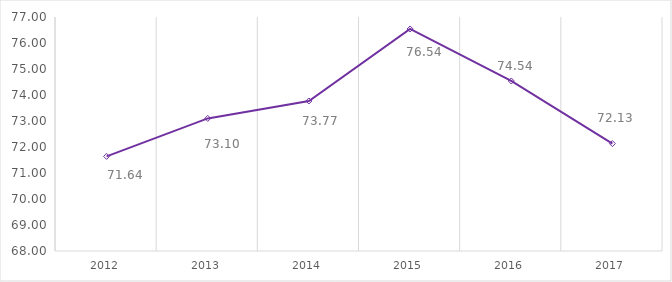
| Category | Series 0 |
|---|---|
| 2012.0 | 71.64 |
| 2013.0 | 73.1 |
| 2014.0 | 73.77 |
| 2015.0 | 76.54 |
| 2016.0 | 74.54 |
| 2017.0 | 72.13 |